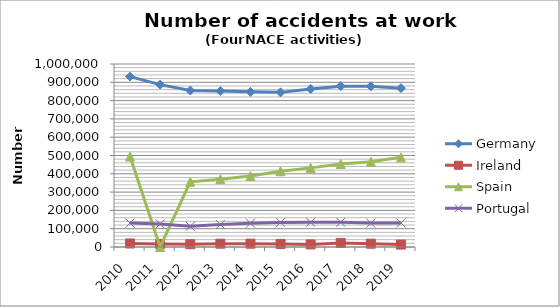
| Category | Germany  | Ireland | Spain | Portugal |
|---|---|---|---|---|
| 2010 | 931014 | 19336 | 494127 | 130475 |
| 2011 | 887356 | 16797 | 18 | 126104 |
| 2012 | 855181 | 15327 | 356110 | 113348 |
| 2013 | 852505 | 18089 | 370446 | 123297 |
| 2014 | 847870 | 18162 | 387719 | 130313 |
| 2015 | 844991 | 16730 | 414100 | 134539 |
| 2016 | 863396 | 14131 | 432348 | 135171 |
| 2017 | 878955 | 22166 | 453754 | 135628 |
| 2018 | 877898 | 18124 | 465550 | 130537 |
| 2019 | 867949 | 13293 | 489990 | 131821 |